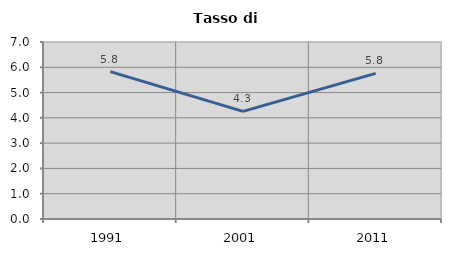
| Category | Tasso di disoccupazione   |
|---|---|
| 1991.0 | 5.827 |
| 2001.0 | 4.258 |
| 2011.0 | 5.757 |